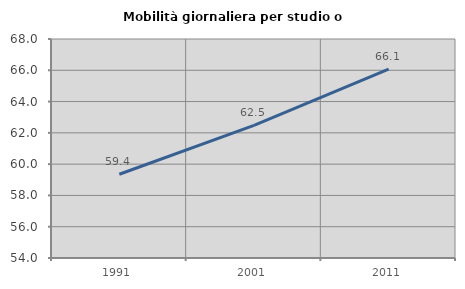
| Category | Mobilità giornaliera per studio o lavoro |
|---|---|
| 1991.0 | 59.353 |
| 2001.0 | 62.482 |
| 2011.0 | 66.07 |